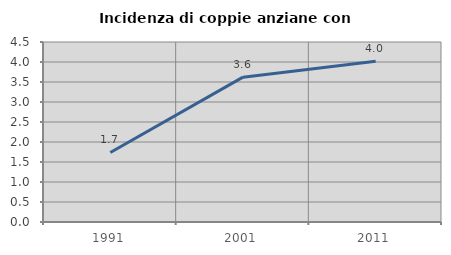
| Category | Incidenza di coppie anziane con figli |
|---|---|
| 1991.0 | 1.738 |
| 2001.0 | 3.621 |
| 2011.0 | 4.019 |